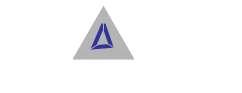
| Category | Series 0 |
|---|---|
| 0 | 2 |
| 1 | 1 |
| 2 | 1.33 |